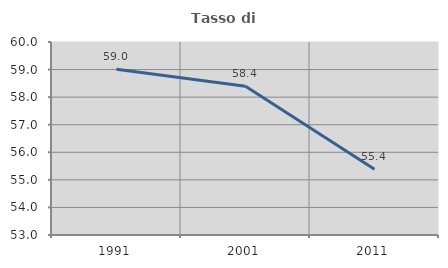
| Category | Tasso di occupazione   |
|---|---|
| 1991.0 | 59.011 |
| 2001.0 | 58.394 |
| 2011.0 | 55.388 |